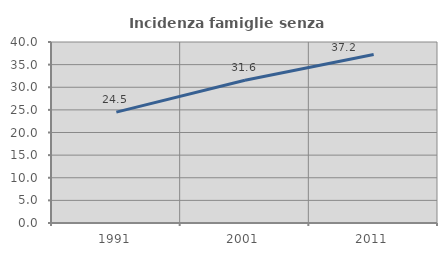
| Category | Incidenza famiglie senza nuclei |
|---|---|
| 1991.0 | 24.506 |
| 2001.0 | 31.551 |
| 2011.0 | 37.23 |